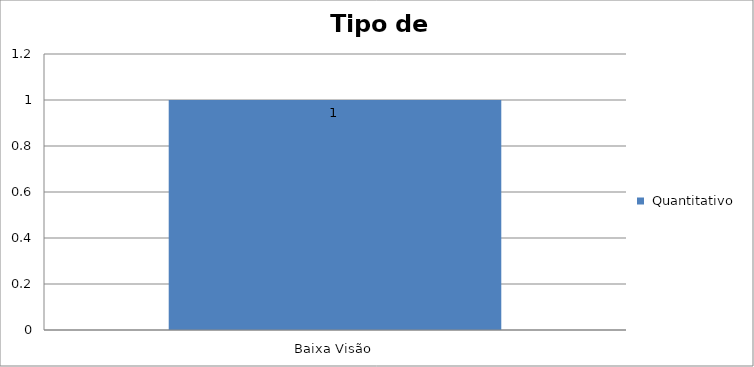
| Category |  Quantitativo |
|---|---|
| Baixa Visão | 1 |